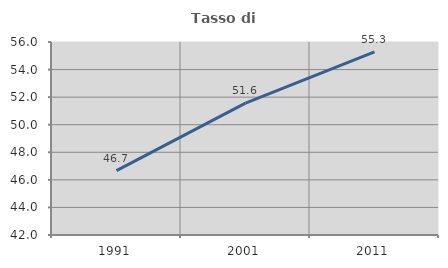
| Category | Tasso di occupazione   |
|---|---|
| 1991.0 | 46.667 |
| 2001.0 | 51.571 |
| 2011.0 | 55.289 |